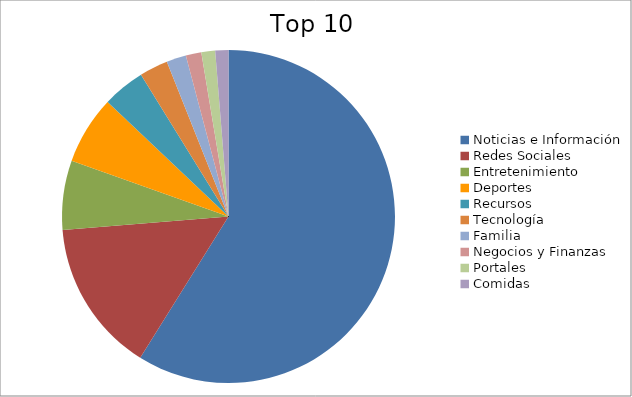
| Category | Series 0 |
|---|---|
| Noticias e Información | 55.82 |
| Redes Sociales | 14.03 |
| Entretenimiento | 6.39 |
| Deportes | 6.28 |
| Recursos | 3.91 |
| Tecnología | 2.63 |
| Familia | 1.81 |
| Negocios y Finanzas | 1.43 |
| Portales | 1.27 |
| Comidas | 1.21 |